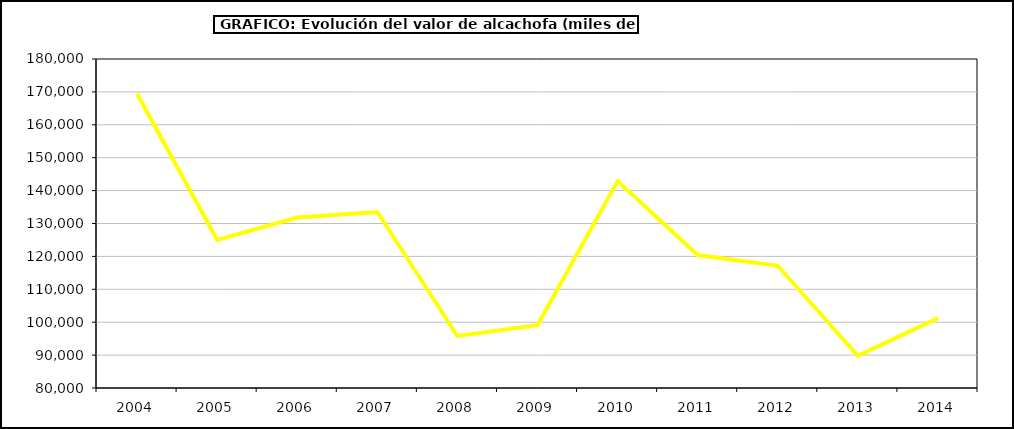
| Category | Valor |
|---|---|
| 2004.0 | 169411.889 |
| 2005.0 | 125044.348 |
| 2006.0 | 131796.472 |
| 2007.0 | 133505.79 |
| 2008.0 | 95815.761 |
| 2009.0 | 99068.13 |
| 2010.0 | 142879.333 |
| 2011.0 | 120418 |
| 2012.0 | 117146.597 |
| 2013.0 | 89795.299 |
| 2014.0 | 101254.898 |